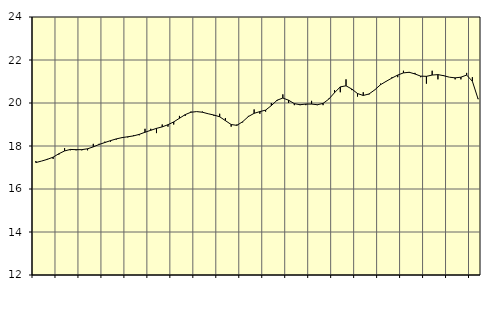
| Category | Piggar | Vård och omsorg, SNI 86-88 |
|---|---|---|
| nan | 17.3 | 17.23 |
| 1.0 | 17.3 | 17.3 |
| 1.0 | 17.4 | 17.38 |
| 1.0 | 17.4 | 17.48 |
| nan | 17.6 | 17.64 |
| 2.0 | 17.9 | 17.77 |
| 2.0 | 17.8 | 17.84 |
| 2.0 | 17.8 | 17.83 |
| nan | 17.8 | 17.83 |
| 3.0 | 17.8 | 17.87 |
| 3.0 | 18.1 | 17.96 |
| 3.0 | 18.1 | 18.07 |
| nan | 18.2 | 18.16 |
| 4.0 | 18.2 | 18.25 |
| 4.0 | 18.3 | 18.33 |
| 4.0 | 18.4 | 18.39 |
| nan | 18.4 | 18.43 |
| 5.0 | 18.5 | 18.47 |
| 5.0 | 18.5 | 18.54 |
| 5.0 | 18.8 | 18.64 |
| nan | 18.8 | 18.73 |
| 6.0 | 18.6 | 18.82 |
| 6.0 | 19 | 18.89 |
| 6.0 | 18.9 | 18.99 |
| nan | 19 | 19.12 |
| 7.0 | 19.4 | 19.29 |
| 7.0 | 19.4 | 19.46 |
| 7.0 | 19.6 | 19.57 |
| nan | 19.6 | 19.6 |
| 8.0 | 19.6 | 19.57 |
| 8.0 | 19.5 | 19.5 |
| 8.0 | 19.4 | 19.44 |
| nan | 19.5 | 19.36 |
| 9.0 | 19.3 | 19.18 |
| 9.0 | 18.9 | 19 |
| 9.0 | 19 | 18.96 |
| nan | 19.1 | 19.13 |
| 10.0 | 19.4 | 19.37 |
| 10.0 | 19.7 | 19.52 |
| 10.0 | 19.5 | 19.6 |
| nan | 19.6 | 19.67 |
| 11.0 | 20 | 19.88 |
| 11.0 | 20.1 | 20.13 |
| 11.0 | 20.4 | 20.23 |
| nan | 20 | 20.13 |
| 12.0 | 19.9 | 19.97 |
| 12.0 | 19.9 | 19.92 |
| 12.0 | 19.9 | 19.95 |
| nan | 20.1 | 19.95 |
| 13.0 | 19.9 | 19.92 |
| 13.0 | 19.9 | 19.98 |
| 13.0 | 20.2 | 20.18 |
| nan | 20.6 | 20.48 |
| 14.0 | 20.5 | 20.75 |
| 14.0 | 21.1 | 20.8 |
| 14.0 | 20.6 | 20.65 |
| nan | 20.3 | 20.44 |
| 15.0 | 20.5 | 20.35 |
| 15.0 | 20.4 | 20.42 |
| 15.0 | 20.6 | 20.61 |
| nan | 20.9 | 20.85 |
| 16.0 | 21 | 21.01 |
| 16.0 | 21.2 | 21.16 |
| 16.0 | 21.2 | 21.3 |
| nan | 21.5 | 21.4 |
| 17.0 | 21.4 | 21.43 |
| 17.0 | 21.4 | 21.35 |
| 17.0 | 21.2 | 21.25 |
| nan | 20.9 | 21.24 |
| 18.0 | 21.5 | 21.3 |
| 18.0 | 21.1 | 21.32 |
| 18.0 | 21.3 | 21.27 |
| nan | 21.2 | 21.2 |
| 19.0 | 21.1 | 21.17 |
| 19.0 | 21.1 | 21.2 |
| 19.0 | 21.4 | 21.3 |
| nan | 21.2 | 21.01 |
| 20.0 | 20.2 | 20.18 |